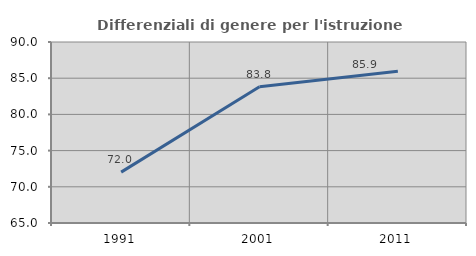
| Category | Differenziali di genere per l'istruzione superiore |
|---|---|
| 1991.0 | 72.027 |
| 2001.0 | 83.808 |
| 2011.0 | 85.948 |